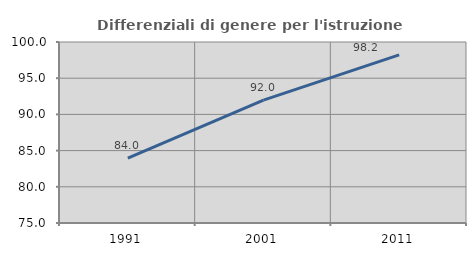
| Category | Differenziali di genere per l'istruzione superiore |
|---|---|
| 1991.0 | 83.97 |
| 2001.0 | 91.979 |
| 2011.0 | 98.215 |